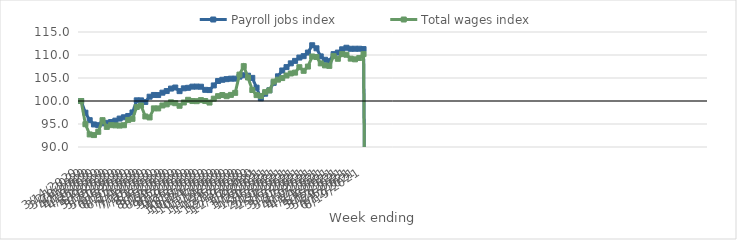
| Category | Payroll jobs index | Total wages index |
|---|---|---|
| 14/03/2020 | 100 | 100 |
| 21/03/2020 | 97.462 | 94.954 |
| 28/03/2020 | 95.832 | 92.731 |
| 04/04/2020 | 94.902 | 92.589 |
| 11/04/2020 | 94.745 | 93.3 |
| 18/04/2020 | 95.144 | 95.831 |
| 25/04/2020 | 95.255 | 94.367 |
| 02/05/2020 | 95.428 | 94.749 |
| 09/05/2020 | 95.732 | 94.698 |
| 16/05/2020 | 96.18 | 94.66 |
| 23/05/2020 | 96.463 | 94.733 |
| 30/05/2020 | 96.745 | 95.882 |
| 06/06/2020 | 97.509 | 96.123 |
| 13/06/2020 | 100.145 | 98.701 |
| 20/06/2020 | 100.133 | 99.022 |
| 27/06/2020 | 99.794 | 96.637 |
| 04/07/2020 | 100.933 | 96.425 |
| 11/07/2020 | 101.314 | 98.398 |
| 18/07/2020 | 101.292 | 98.389 |
| 25/07/2020 | 101.812 | 99.027 |
| 01/08/2020 | 102.163 | 99.266 |
| 08/08/2020 | 102.699 | 99.708 |
| 15/08/2020 | 102.928 | 99.518 |
| 22/08/2020 | 102.144 | 98.967 |
| 29/08/2020 | 102.752 | 99.68 |
| 05/09/2020 | 102.87 | 100.264 |
| 12/09/2020 | 103.122 | 99.99 |
| 19/09/2020 | 103.134 | 99.962 |
| 26/09/2020 | 103.106 | 100.187 |
| 03/10/2020 | 102.428 | 99.995 |
| 10/10/2020 | 102.376 | 99.661 |
| 17/10/2020 | 103.385 | 100.509 |
| 24/10/2020 | 104.352 | 101.056 |
| 31/10/2020 | 104.616 | 101.3 |
| 07/11/2020 | 104.75 | 101.042 |
| 14/11/2020 | 104.857 | 101.327 |
| 21/11/2020 | 104.862 | 101.767 |
| 28/11/2020 | 105.295 | 105.741 |
| 05/12/2020 | 105.603 | 107.574 |
| 12/12/2020 | 105.503 | 105.112 |
| 19/12/2020 | 105.025 | 102.391 |
| 26/12/2020 | 102.898 | 101.282 |
| 02/01/2021 | 100.584 | 101.096 |
| 09/01/2021 | 101.587 | 101.926 |
| 16/01/2021 | 102.328 | 102.3 |
| 23/01/2021 | 103.95 | 104.219 |
| 30/01/2021 | 105.364 | 104.643 |
| 06/02/2021 | 106.636 | 104.984 |
| 13/02/2021 | 107.368 | 105.544 |
| 20/02/2021 | 108.184 | 105.982 |
| 27/02/2021 | 108.724 | 106.17 |
| 06/03/2021 | 109.444 | 107.352 |
| 13/03/2021 | 109.746 | 106.56 |
| 20/03/2021 | 110.531 | 107.486 |
| 27/03/2021 | 112.117 | 109.678 |
| 03/04/2021 | 111.458 | 109.558 |
| 10/04/2021 | 109.698 | 108.174 |
| 17/04/2021 | 108.966 | 107.739 |
| 24/04/2021 | 108.658 | 107.635 |
| 01/05/2021 | 110.193 | 109.758 |
| 08/05/2021 | 110.53 | 109.177 |
| 15/05/2021 | 111.237 | 110.192 |
| 22/05/2021 | 111.579 | 110.059 |
| 29/05/2021 | 111.351 | 109.208 |
| 05/06/2021 | 111.36 | 109.058 |
| 12/06/2021 | 111.361 | 109.359 |
| 19/06/2021 | 111.288 | 110.188 |